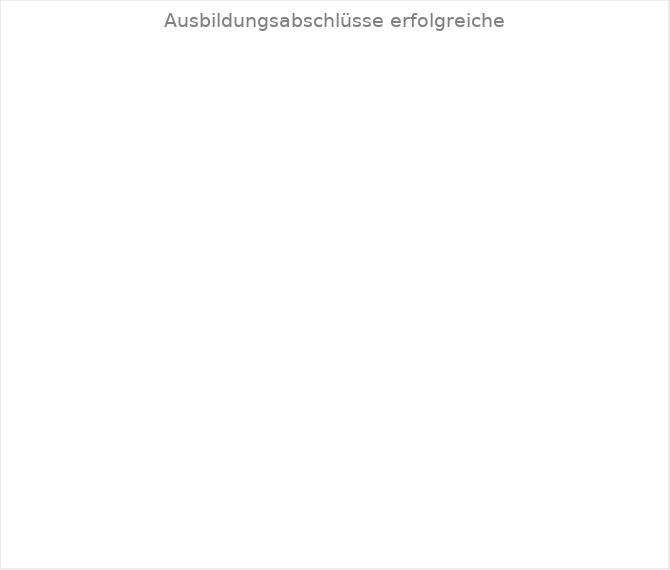
| Category | Series 1 |
|---|---|
| JA | 0 |
| NEIN | 0 |
| Abbruch | 0 |